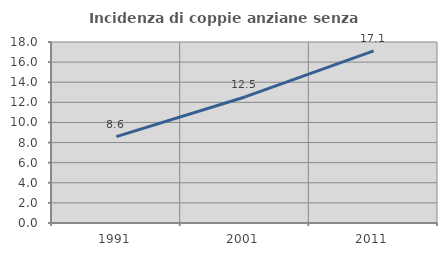
| Category | Incidenza di coppie anziane senza figli  |
|---|---|
| 1991.0 | 8.595 |
| 2001.0 | 12.535 |
| 2011.0 | 17.117 |